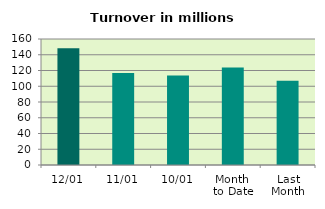
| Category | Series 0 |
|---|---|
| 12/01 | 148.292 |
| 11/01 | 116.93 |
| 10/01 | 113.662 |
| Month 
to Date | 123.685 |
| Last
Month | 107.094 |